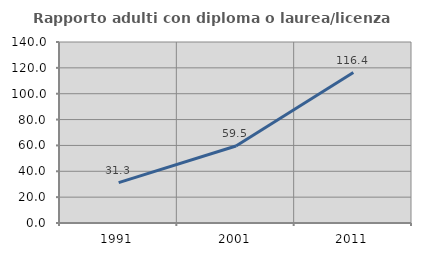
| Category | Rapporto adulti con diploma o laurea/licenza media  |
|---|---|
| 1991.0 | 31.27 |
| 2001.0 | 59.542 |
| 2011.0 | 116.376 |